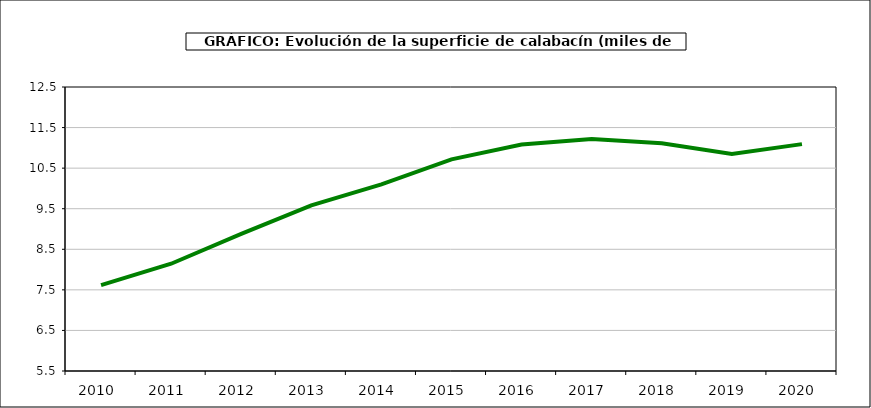
| Category | superficie |
|---|---|
| 2010.0 | 7.618 |
| 2011.0 | 8.144 |
| 2012.0 | 8.879 |
| 2013.0 | 9.582 |
| 2014.0 | 10.102 |
| 2015.0 | 10.717 |
| 2016.0 | 11.081 |
| 2017.0 | 11.218 |
| 2018.0 | 11.112 |
| 2019.0 | 10.851 |
| 2020.0 | 11.092 |